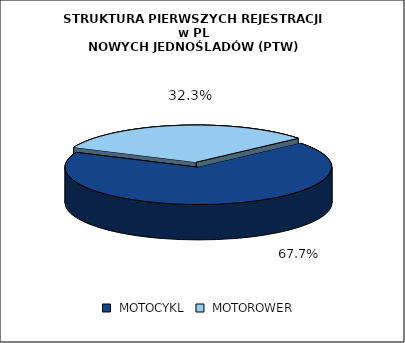
| Category | RAZEM |
|---|---|
|  MOTOCYKL  | 0.677 |
|  MOTOROWER  | 0.323 |